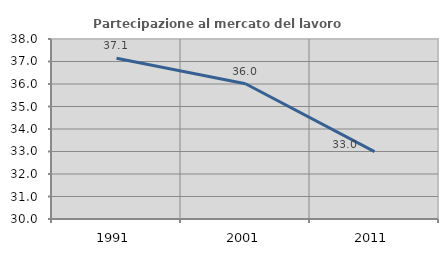
| Category | Partecipazione al mercato del lavoro  femminile |
|---|---|
| 1991.0 | 37.143 |
| 2001.0 | 36.013 |
| 2011.0 | 32.993 |